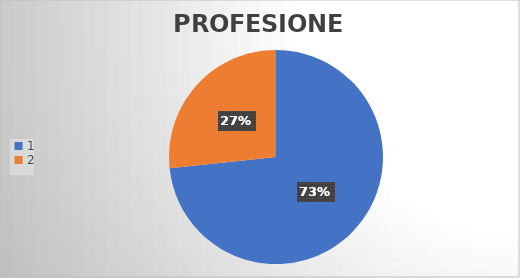
| Category | Series 0 |
|---|---|
| 0 | 11 |
| 1 | 4 |